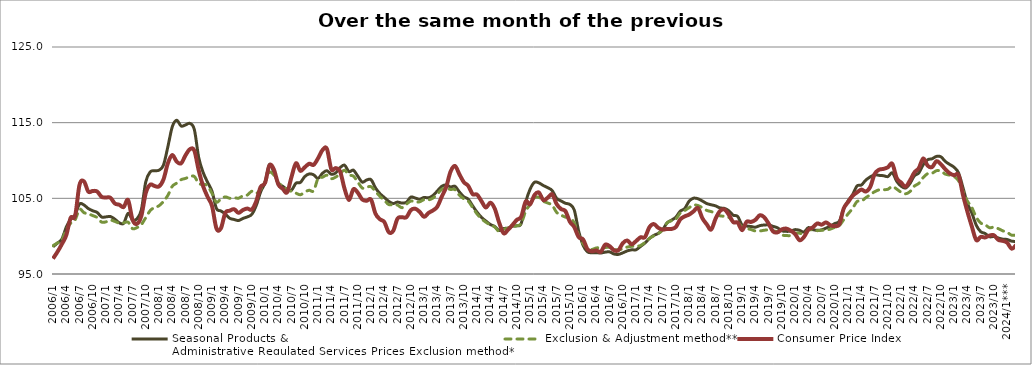
| Category | Seasonal Products &
Administrative Regulated Services Prices Exclusion method* | Exclusion & Adjustment method** | Consumer Price Index |
|---|---|---|---|
| 2006/1 | 98.595 | 98.744 | 97.026 |
| 2006/2 | 99.083 | 99.102 | 97.919 |
| 2006/3 | 99.604 | 99.448 | 98.94 |
| 2006/4 | 101.192 | 100.872 | 100.122 |
| 2006/5 | 102.216 | 101.712 | 102.427 |
| 2006/6 | 102.814 | 102.154 | 102.658 |
| 2006/7 | 104.247 | 103.54 | 106.771 |
| 2006/8 | 104.121 | 103.11 | 107.245 |
| 2006/9 | 103.645 | 102.943 | 105.885 |
| 2006/10 | 103.355 | 102.721 | 105.978 |
| 2006/11 | 103.136 | 102.459 | 105.899 |
| 2006/12 | 102.532 | 101.862 | 105.194 |
| 2007/1 | 102.549 | 101.894 | 105.117 |
| 2007/2 | 102.594 | 102.114 | 105.078 |
| 2007/3 | 102.246 | 101.947 | 104.317 |
| 2007/4 | 101.768 | 101.726 | 104.152 |
| 2007/5 | 101.702 | 101.762 | 103.845 |
| 2007/6 | 103.01 | 101.846 | 104.777 |
| 2007/7 | 102.152 | 100.997 | 102.167 |
| 2007/8 | 102.298 | 101.135 | 101.633 |
| 2007/9 | 103.486 | 101.534 | 102.676 |
| 2007/10 | 107.183 | 102.456 | 105.7 |
| 2007/11 | 108.49 | 103.373 | 106.805 |
| 2007/12 | 108.65 | 103.791 | 106.629 |
| 2008/1 | 108.721 | 104.021 | 106.576 |
| 2008/2 | 109.383 | 104.584 | 107.474 |
| 2008/3 | 111.807 | 105.391 | 109.624 |
| 2008/4 | 114.452 | 106.583 | 110.725 |
| 2008/5 | 115.322 | 107.014 | 109.854 |
| 2008/6 | 114.557 | 107.464 | 109.625 |
| 2008/7 | 114.7 | 107.634 | 110.685 |
| 2008/8 | 114.899 | 107.867 | 111.494 |
| 2008/9 | 114.083 | 107.886 | 111.302 |
| 2008/10 | 110.346 | 106.949 | 108.649 |
| 2008/11 | 108.409 | 106.882 | 106.581 |
| 2008/12 | 107.12 | 106.646 | 105.193 |
| 2009/1 | 105.924 | 105.638 | 103.984 |
| 2009/2 | 103.659 | 104.48 | 101.027 |
| 2009/3 | 103.337 | 104.93 | 101.025 |
| 2009/4 | 102.932 | 105.188 | 103.07 |
| 2009/5 | 102.366 | 105.012 | 103.366 |
| 2009/6 | 102.204 | 105.092 | 103.565 |
| 2009/7 | 102.069 | 105.018 | 103.081 |
| 2009/8 | 102.344 | 105.328 | 103.46 |
| 2009/9 | 102.55 | 105.438 | 103.651 |
| 2009/10 | 102.881 | 105.932 | 103.512 |
| 2009/11 | 104.039 | 105.654 | 104.601 |
| 2009/12 | 105.841 | 106.187 | 106.501 |
| 2010/1 | 107.109 | 107.172 | 107.037 |
| 2010/2 | 109.476 | 108.443 | 109.358 |
| 2010/3 | 108.418 | 108.074 | 108.81 |
| 2010/4 | 106.983 | 107.05 | 106.849 |
| 2010/5 | 106.59 | 106.632 | 106.266 |
| 2010/6 | 106.188 | 106.12 | 105.799 |
| 2010/7 | 106.077 | 105.922 | 107.84 |
| 2010/8 | 107.006 | 105.685 | 109.635 |
| 2010/9 | 107.098 | 105.474 | 108.631 |
| 2010/10 | 107.88 | 105.843 | 109.11 |
| 2010/11 | 108.224 | 106.065 | 109.573 |
| 2010/12 | 108.108 | 106.002 | 109.426 |
| 2011/1 | 107.64 | 107.616 | 110.292 |
| 2011/2 | 108.306 | 107.787 | 111.374 |
| 2011/3 | 108.65 | 108.06 | 111.547 |
| 2011/4 | 108.181 | 107.6 | 108.851 |
| 2011/5 | 108.359 | 107.808 | 108.996 |
| 2011/6 | 109.052 | 108.271 | 108.536 |
| 2011/7 | 109.39 | 108.709 | 106.276 |
| 2011/8 | 108.531 | 108.095 | 104.769 |
| 2011/9 | 108.724 | 107.931 | 106.197 |
| 2011/10 | 107.927 | 107.155 | 105.744 |
| 2011/11 | 107.144 | 106.364 | 104.847 |
| 2011/12 | 107.42 | 106.479 | 104.678 |
| 2012/1 | 107.468 | 106.535 | 104.823 |
| 2012/2 | 106.382 | 105.929 | 102.978 |
| 2012/3 | 105.632 | 105.27 | 102.241 |
| 2012/4 | 105.116 | 104.743 | 101.875 |
| 2012/5 | 104.604 | 104.174 | 100.533 |
| 2012/6 | 104.314 | 104.173 | 100.695 |
| 2012/7 | 104.505 | 104.102 | 102.332 |
| 2012/8 | 104.37 | 103.765 | 102.494 |
| 2012/9 | 104.485 | 104.225 | 102.502 |
| 2012/10 | 105.16 | 104.641 | 103.434 |
| 2012/11 | 105.038 | 104.512 | 103.629 |
| 2012/12 | 104.883 | 104.544 | 103.22 |
| 2013/1 | 105.117 | 104.829 | 102.552 |
| 2013/2 | 105.071 | 104.802 | 103.067 |
| 2013/3 | 105.367 | 105.028 | 103.397 |
| 2013/4 | 105.975 | 105.562 | 103.898 |
| 2013/5 | 106.588 | 106.185 | 105.214 |
| 2013/6 | 106.774 | 106.317 | 106.481 |
| 2013/7 | 106.507 | 106.175 | 108.54 |
| 2013/8 | 106.588 | 106.147 | 109.277 |
| 2013/9 | 105.843 | 105.414 | 108.176 |
| 2013/10 | 105.205 | 104.943 | 107.138 |
| 2013/11 | 104.889 | 104.629 | 106.649 |
| 2013/12 | 104.008 | 103.79 | 105.556 |
| 2014/1 | 103.166 | 102.933 | 105.489 |
| 2014/2 | 102.481 | 102.31 | 104.622 |
| 2014/3 | 101.998 | 101.84 | 103.782 |
| 2014/4 | 101.544 | 101.482 | 104.429 |
| 2014/5 | 101.279 | 101.202 | 103.641 |
| 2014/6 | 100.745 | 100.62 | 101.794 |
| 2014/7 | 101.008 | 100.904 | 100.391 |
| 2014/8 | 101.06 | 101.059 | 100.84 |
| 2014/9 | 101.319 | 101.285 | 101.469 |
| 2014/10 | 101.369 | 101.374 | 102.156 |
| 2014/11 | 101.694 | 101.689 | 102.582 |
| 2014/12 | 104.473 | 103.305 | 104.58 |
| 2015/1 | 106.203 | 104.19 | 104.207 |
| 2015/2 | 107.125 | 105.068 | 105.435 |
| 2015/3 | 107.036 | 105.114 | 105.766 |
| 2015/4 | 106.692 | 104.625 | 104.76 |
| 2015/5 | 106.403 | 104.382 | 105.083 |
| 2015/6 | 106.031 | 104.094 | 105.541 |
| 2015/7 | 105.01 | 103.156 | 104.247 |
| 2015/8 | 104.662 | 102.793 | 103.589 |
| 2015/9 | 104.351 | 102.517 | 103.309 |
| 2015/10 | 104.19 | 102.396 | 101.911 |
| 2015/11 | 103.46 | 101.753 | 101.207 |
| 2015/12 | 100.668 | 100.109 | 99.871 |
| 2016/1 | 98.793 | 99.002 | 99.574 |
| 2016/2 | 97.927 | 98.433 | 98.264 |
| 2016/3 | 97.804 | 98.253 | 98.007 |
| 2016/4 | 97.818 | 98.444 | 98.116 |
| 2016/5 | 97.774 | 98.462 | 97.93 |
| 2016/6 | 97.888 | 98.504 | 98.874 |
| 2016/7 | 97.923 | 98.516 | 98.681 |
| 2016/8 | 97.645 | 98.237 | 98.131 |
| 2016/9 | 97.594 | 98.198 | 98.143 |
| 2016/10 | 97.799 | 98.342 | 99.081 |
| 2016/11 | 98.054 | 98.562 | 99.426 |
| 2016/12 | 98.195 | 98.661 | 98.922 |
| 2017/1 | 98.206 | 98.67 | 99.354 |
| 2017/2 | 98.641 | 98.766 | 99.846 |
| 2017/3 | 99.095 | 99.167 | 99.87 |
| 2017/4 | 99.684 | 99.695 | 101.173 |
| 2017/5 | 100.098 | 100.042 | 101.603 |
| 2017/6 | 100.364 | 100.332 | 101.109 |
| 2017/7 | 100.841 | 100.821 | 100.869 |
| 2017/8 | 101.75 | 101.74 | 100.947 |
| 2017/9 | 102.111 | 102.04 | 100.954 |
| 2017/10 | 102.513 | 102.262 | 101.212 |
| 2017/11 | 103.306 | 103.061 | 102.22 |
| 2017/12 | 103.648 | 103.386 | 102.611 |
| 2018/1 | 104.624 | 103.763 | 102.853 |
| 2018/2 | 105.018 | 104.116 | 103.273 |
| 2018/3 | 104.945 | 104.048 | 103.726 |
| 2018/4 | 104.648 | 103.757 | 102.372 |
| 2018/5 | 104.313 | 103.405 | 101.558 |
| 2018/6 | 104.147 | 103.247 | 100.877 |
| 2018/7 | 104.004 | 103.021 | 102.327 |
| 2018/8 | 103.73 | 102.689 | 103.326 |
| 2018/9 | 103.67 | 102.626 | 103.525 |
| 2018/10 | 103.352 | 102.489 | 102.83 |
| 2018/11 | 102.761 | 101.893 | 101.848 |
| 2018/12 | 102.607 | 101.77 | 101.791 |
| 2019/1 | 101.456 | 101.221 | 100.791 |
| 2019/2 | 101.336 | 101.02 | 101.898 |
| 2019/3 | 101.277 | 100.876 | 101.881 |
| 2019/4 | 101.188 | 100.685 | 102.15 |
| 2019/5 | 101.388 | 100.691 | 102.765 |
| 2019/6 | 101.477 | 100.779 | 102.5 |
| 2019/7 | 101.481 | 100.837 | 101.657 |
| 2019/8 | 101.297 | 100.702 | 100.628 |
| 2019/9 | 101.106 | 100.576 | 100.5 |
| 2019/10 | 100.709 | 100.162 | 100.9 |
| 2019/11 | 100.635 | 100.084 | 101 |
| 2019/12 | 100.662 | 100.093 | 100.728 |
| 2020/1 | 100.865 | 100.37 | 100.277 |
| 2020/2 | 100.772 | 100.393 | 99.459 |
| 2020/3 | 100.542 | 100.253 | 99.89 |
| 2020/4 | 101.132 | 100.803 | 100.855 |
| 2020/5 | 100.863 | 100.81 | 101.158 |
| 2020/6 | 100.777 | 100.73 | 101.678 |
| 2020/7 | 100.834 | 100.779 | 101.519 |
| 2020/8 | 101.067 | 100.793 | 101.817 |
| 2020/9 | 101.34 | 100.943 | 101.433 |
| 2020/10 | 101.677 | 101.176 | 101.344 |
| 2020/11 | 101.984 | 101.4 | 101.559 |
| 2020/12 | 103.62 | 102.177 | 103.664 |
| 2021/1 | 104.678 | 102.959 | 104.515 |
| 2021/2 | 105.485 | 103.654 | 105.327 |
| 2021/3 | 106.63 | 104.57 | 105.781 |
| 2021/4 | 106.763 | 104.626 | 106.157 |
| 2021/5 | 107.411 | 105.084 | 105.901 |
| 2021/6 | 107.832 | 105.478 | 106.505 |
| 2021/7 | 108.109 | 105.876 | 108.223 |
| 2021/8 | 108.038 | 106.122 | 108.782 |
| 2021/9 | 107.988 | 106.135 | 108.889 |
| 2021/10 | 107.877 | 106.201 | 109.104 |
| 2021/11 | 108.377 | 106.574 | 109.557 |
| 2021/12 | 107.251 | 106.217 | 107.675 |
| 2022/1 | 106.602 | 105.803 | 107.077 |
| 2022/2 | 106.361 | 105.595 | 106.543 |
| 2022/3 | 106.967 | 105.892 | 107.362 |
| 2022/4 | 107.98 | 106.619 | 108.425 |
| 2022/5 | 108.356 | 106.983 | 108.986 |
| 2022/6 | 109.44 | 107.755 | 110.274 |
| 2022/7 | 110.1 | 108.261 | 109.322 |
| 2022/8 | 110.23 | 108.313 | 109.129 |
| 2022/9 | 110.54 | 108.654 | 109.915 |
| 2022/10 | 110.488 | 108.593 | 109.5 |
| 2022/11 | 109.876 | 108.205 | 108.845 |
| 2022/12 | 109.479 | 108.061 | 108.303 |
| 2023/1 | 109.099 | 107.874 | 108.051 |
| 2023/2 | 108.357 | 107.314 | 108.05 |
| 2023/3 | 106.407 | 105.982 | 105.45 |
| 2023/4 | 104.305 | 104.64 | 103.237 |
| 2023/5 | 103.087 | 103.783 | 101.287 |
| 2023/6 | 101.452 | 102.51 | 99.492 |
| 2023/7 | 100.599 | 101.742 | 99.899 |
| 2023/8 | 100.353 | 101.528 | 99.832 |
| 2023/9 | 99.919 | 101.111 | 100.076 |
| 2023/10 | 99.953 | 101.197 | 100.122 |
| 2023/11 | 99.756 | 100.99 | 99.511 |
| 2023/12 | 99.606 | 100.704 | 99.38 |
| 2024/1*** | 99.559 | 100.5 | 99.14 |
| 2024/2 | 99.346 | 100.132 | 98.349 |
| 2024/3 | 99.29 | 100.132 | 98.799 |